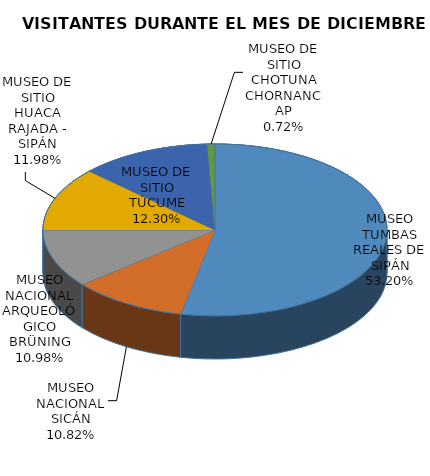
| Category | visitantes |
|---|---|
| MUSEO TUMBAS REALES DE SIPÁN | 12094 |
| MUSEO NACIONAL SICÁN | 2459 |
| MUSEO NACIONAL ARQUEOLÓGICO BRÜNING | 2495 |
| MUSEO DE SITIO HUACA RAJADA - SIPÁN | 2724 |
| MUSEO DE SITIO TÚCUME | 2796 |
| MUSEO DE SITIO CHOTUNA CHORNANCAP | 164 |